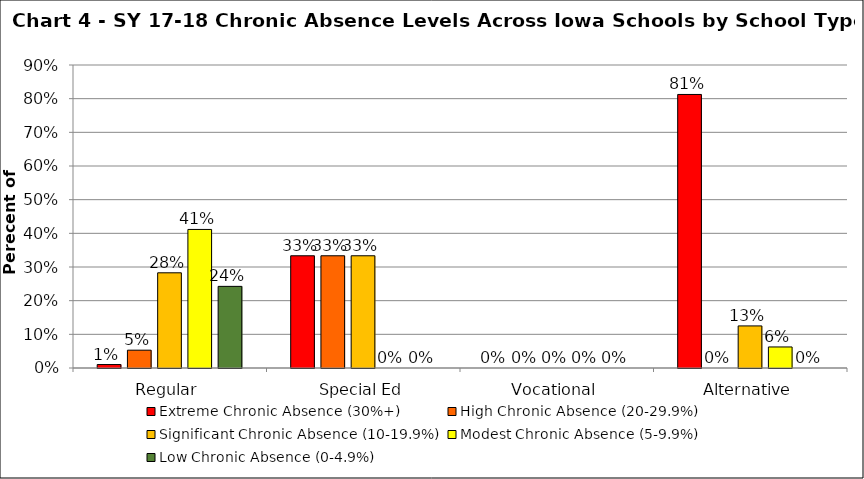
| Category | Extreme Chronic Absence (30%+) | High Chronic Absence (20-29.9%) | Significant Chronic Absence (10-19.9%) | Modest Chronic Absence (5-9.9%) | Low Chronic Absence (0-4.9%) |
|---|---|---|---|---|---|
| 0 | 0.01 | 0.053 | 0.283 | 0.412 | 0.242 |
| 1 | 0.333 | 0.333 | 0.333 | 0 | 0 |
| 2 | 0 | 0 | 0 | 0 | 0 |
| 3 | 0.812 | 0 | 0.125 | 0.062 | 0 |